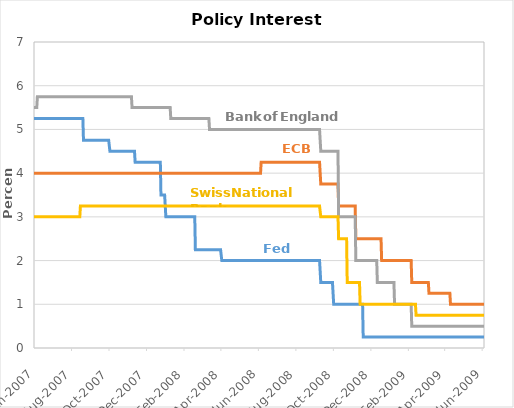
| Category | Federal Funds Target Rate | ECB Main Refinancing Operations Announcement Rate | BoE Official Bank Rate | SNB Libor Target Rate |
|---|---|---|---|---|
| 2007-01-02 | 5.25 | 3.5 | 5 | 2.5 |
| 2007-01-03 | 5.25 | 3.5 | 5 | 2.5 |
| 2007-01-04 | 5.25 | 3.5 | 5 | 2.5 |
| 2007-01-05 | 5.25 | 3.5 | 5 | 2.5 |
| 2007-01-08 | 5.25 | 3.5 | 5 | 2.5 |
| 2007-01-09 | 5.25 | 3.5 | 5 | 2.5 |
| 2007-01-10 | 5.25 | 3.5 | 5 | 2.5 |
| 2007-01-11 | 5.25 | 3.5 | 5.25 | 2.5 |
| 2007-01-12 | 5.25 | 3.5 | 5.25 | 2.5 |
| 2007-01-15 | 5.25 | 3.5 | 5.25 | 2.5 |
| 2007-01-16 | 5.25 | 3.5 | 5.25 | 2.5 |
| 2007-01-17 | 5.25 | 3.5 | 5.25 | 2.5 |
| 2007-01-18 | 5.25 | 3.5 | 5.25 | 2.5 |
| 2007-01-19 | 5.25 | 3.5 | 5.25 | 2.5 |
| 2007-01-22 | 5.25 | 3.5 | 5.25 | 2.5 |
| 2007-01-23 | 5.25 | 3.5 | 5.25 | 2.5 |
| 2007-01-24 | 5.25 | 3.5 | 5.25 | 2.5 |
| 2007-01-25 | 5.25 | 3.5 | 5.25 | 2.5 |
| 2007-01-26 | 5.25 | 3.5 | 5.25 | 2.5 |
| 2007-01-29 | 5.25 | 3.5 | 5.25 | 2.5 |
| 2007-01-30 | 5.25 | 3.5 | 5.25 | 2.5 |
| 2007-01-31 | 5.25 | 3.5 | 5.25 | 2.5 |
| 2007-02-01 | 5.25 | 3.5 | 5.25 | 2.5 |
| 2007-02-02 | 5.25 | 3.5 | 5.25 | 2.5 |
| 2007-02-05 | 5.25 | 3.5 | 5.25 | 2.5 |
| 2007-02-06 | 5.25 | 3.5 | 5.25 | 2.5 |
| 2007-02-07 | 5.25 | 3.5 | 5.25 | 2.5 |
| 2007-02-08 | 5.25 | 3.5 | 5.25 | 2.5 |
| 2007-02-09 | 5.25 | 3.5 | 5.25 | 2.5 |
| 2007-02-12 | 5.25 | 3.5 | 5.25 | 2.5 |
| 2007-02-13 | 5.25 | 3.5 | 5.25 | 2.5 |
| 2007-02-14 | 5.25 | 3.5 | 5.25 | 2.5 |
| 2007-02-15 | 5.25 | 3.5 | 5.25 | 2.5 |
| 2007-02-16 | 5.25 | 3.5 | 5.25 | 2.5 |
| 2007-02-19 | 5.25 | 3.5 | 5.25 | 2.5 |
| 2007-02-20 | 5.25 | 3.5 | 5.25 | 2.5 |
| 2007-02-21 | 5.25 | 3.5 | 5.25 | 2.5 |
| 2007-02-22 | 5.25 | 3.5 | 5.25 | 2.5 |
| 2007-02-23 | 5.25 | 3.5 | 5.25 | 2.5 |
| 2007-02-26 | 5.25 | 3.5 | 5.25 | 2.5 |
| 2007-02-27 | 5.25 | 3.5 | 5.25 | 2.5 |
| 2007-02-28 | 5.25 | 3.5 | 5.25 | 2.5 |
| 2007-03-01 | 5.25 | 3.5 | 5.25 | 2.5 |
| 2007-03-02 | 5.25 | 3.5 | 5.25 | 2.5 |
| 2007-03-05 | 5.25 | 3.5 | 5.25 | 2.5 |
| 2007-03-06 | 5.25 | 3.5 | 5.25 | 2.5 |
| 2007-03-07 | 5.25 | 3.5 | 5.25 | 2.5 |
| 2007-03-08 | 5.25 | 3.75 | 5.25 | 2.5 |
| 2007-03-09 | 5.25 | 3.75 | 5.25 | 2.5 |
| 2007-03-12 | 5.25 | 3.75 | 5.25 | 2.5 |
| 2007-03-13 | 5.25 | 3.75 | 5.25 | 2.5 |
| 2007-03-14 | 5.25 | 3.75 | 5.25 | 2.5 |
| 2007-03-15 | 5.25 | 3.75 | 5.25 | 2.75 |
| 2007-03-16 | 5.25 | 3.75 | 5.25 | 2.75 |
| 2007-03-19 | 5.25 | 3.75 | 5.25 | 2.75 |
| 2007-03-20 | 5.25 | 3.75 | 5.25 | 2.75 |
| 2007-03-21 | 5.25 | 3.75 | 5.25 | 2.75 |
| 2007-03-22 | 5.25 | 3.75 | 5.25 | 2.75 |
| 2007-03-23 | 5.25 | 3.75 | 5.25 | 2.75 |
| 2007-03-26 | 5.25 | 3.75 | 5.25 | 2.75 |
| 2007-03-27 | 5.25 | 3.75 | 5.25 | 2.75 |
| 2007-03-28 | 5.25 | 3.75 | 5.25 | 2.75 |
| 2007-03-29 | 5.25 | 3.75 | 5.25 | 2.75 |
| 2007-03-30 | 5.25 | 3.75 | 5.25 | 2.75 |
| 2007-04-02 | 5.25 | 3.75 | 5.25 | 2.75 |
| 2007-04-03 | 5.25 | 3.75 | 5.25 | 2.75 |
| 2007-04-04 | 5.25 | 3.75 | 5.25 | 2.75 |
| 2007-04-05 | 5.25 | 3.75 | 5.25 | 2.75 |
| 2007-04-06 | 5.25 | 3.75 | 5.25 | 2.75 |
| 2007-04-09 | 5.25 | 3.75 | 5.25 | 2.75 |
| 2007-04-10 | 5.25 | 3.75 | 5.25 | 2.75 |
| 2007-04-11 | 5.25 | 3.75 | 5.25 | 2.75 |
| 2007-04-12 | 5.25 | 3.75 | 5.25 | 2.75 |
| 2007-04-13 | 5.25 | 3.75 | 5.25 | 2.75 |
| 2007-04-16 | 5.25 | 3.75 | 5.25 | 2.75 |
| 2007-04-17 | 5.25 | 3.75 | 5.25 | 2.75 |
| 2007-04-18 | 5.25 | 3.75 | 5.25 | 2.75 |
| 2007-04-19 | 5.25 | 3.75 | 5.25 | 2.75 |
| 2007-04-20 | 5.25 | 3.75 | 5.25 | 2.75 |
| 2007-04-23 | 5.25 | 3.75 | 5.25 | 2.75 |
| 2007-04-24 | 5.25 | 3.75 | 5.25 | 2.75 |
| 2007-04-25 | 5.25 | 3.75 | 5.25 | 2.75 |
| 2007-04-26 | 5.25 | 3.75 | 5.25 | 2.75 |
| 2007-04-27 | 5.25 | 3.75 | 5.25 | 2.75 |
| 2007-04-30 | 5.25 | 3.75 | 5.25 | 2.75 |
| 2007-05-01 | 5.25 | 3.75 | 5.25 | 2.75 |
| 2007-05-02 | 5.25 | 3.75 | 5.25 | 2.75 |
| 2007-05-03 | 5.25 | 3.75 | 5.25 | 2.75 |
| 2007-05-04 | 5.25 | 3.75 | 5.25 | 2.75 |
| 2007-05-07 | 5.25 | 3.75 | 5.25 | 2.75 |
| 2007-05-08 | 5.25 | 3.75 | 5.25 | 2.75 |
| 2007-05-09 | 5.25 | 3.75 | 5.25 | 2.75 |
| 2007-05-10 | 5.25 | 3.75 | 5.5 | 2.75 |
| 2007-05-11 | 5.25 | 3.75 | 5.5 | 2.75 |
| 2007-05-14 | 5.25 | 3.75 | 5.5 | 2.75 |
| 2007-05-15 | 5.25 | 3.75 | 5.5 | 2.75 |
| 2007-05-16 | 5.25 | 3.75 | 5.5 | 2.75 |
| 2007-05-17 | 5.25 | 3.75 | 5.5 | 2.75 |
| 2007-05-18 | 5.25 | 3.75 | 5.5 | 2.75 |
| 2007-05-21 | 5.25 | 3.75 | 5.5 | 2.75 |
| 2007-05-22 | 5.25 | 3.75 | 5.5 | 2.75 |
| 2007-05-23 | 5.25 | 3.75 | 5.5 | 2.75 |
| 2007-05-24 | 5.25 | 3.75 | 5.5 | 2.75 |
| 2007-05-25 | 5.25 | 3.75 | 5.5 | 2.75 |
| 2007-05-28 | 5.25 | 3.75 | 5.5 | 2.75 |
| 2007-05-29 | 5.25 | 3.75 | 5.5 | 2.75 |
| 2007-05-30 | 5.25 | 3.75 | 5.5 | 2.75 |
| 2007-05-31 | 5.25 | 3.75 | 5.5 | 2.75 |
| 2007-06-01 | 5.25 | 3.75 | 5.5 | 2.75 |
| 2007-06-04 | 5.25 | 3.75 | 5.5 | 2.75 |
| 2007-06-05 | 5.25 | 3.75 | 5.5 | 2.75 |
| 2007-06-06 | 5.25 | 4 | 5.5 | 2.75 |
| 2007-06-07 | 5.25 | 4 | 5.5 | 2.75 |
| 2007-06-08 | 5.25 | 4 | 5.5 | 2.75 |
| 2007-06-11 | 5.25 | 4 | 5.5 | 2.75 |
| 2007-06-12 | 5.25 | 4 | 5.5 | 2.75 |
| 2007-06-13 | 5.25 | 4 | 5.5 | 2.75 |
| 2007-06-14 | 5.25 | 4 | 5.5 | 3 |
| 2007-06-15 | 5.25 | 4 | 5.5 | 3 |
| 2007-06-18 | 5.25 | 4 | 5.5 | 3 |
| 2007-06-19 | 5.25 | 4 | 5.5 | 3 |
| 2007-06-20 | 5.25 | 4 | 5.5 | 3 |
| 2007-06-21 | 5.25 | 4 | 5.5 | 3 |
| 2007-06-22 | 5.25 | 4 | 5.5 | 3 |
| 2007-06-25 | 5.25 | 4 | 5.5 | 3 |
| 2007-06-26 | 5.25 | 4 | 5.5 | 3 |
| 2007-06-27 | 5.25 | 4 | 5.5 | 3 |
| 2007-06-28 | 5.25 | 4 | 5.5 | 3 |
| 2007-06-29 | 5.25 | 4 | 5.5 | 3 |
| 2007-07-02 | 5.25 | 4 | 5.5 | 3 |
| 2007-07-03 | 5.25 | 4 | 5.5 | 3 |
| 2007-07-04 | 5.25 | 4 | 5.5 | 3 |
| 2007-07-05 | 5.25 | 4 | 5.75 | 3 |
| 2007-07-06 | 5.25 | 4 | 5.75 | 3 |
| 2007-07-09 | 5.25 | 4 | 5.75 | 3 |
| 2007-07-10 | 5.25 | 4 | 5.75 | 3 |
| 2007-07-11 | 5.25 | 4 | 5.75 | 3 |
| 2007-07-12 | 5.25 | 4 | 5.75 | 3 |
| 2007-07-13 | 5.25 | 4 | 5.75 | 3 |
| 2007-07-16 | 5.25 | 4 | 5.75 | 3 |
| 2007-07-17 | 5.25 | 4 | 5.75 | 3 |
| 2007-07-18 | 5.25 | 4 | 5.75 | 3 |
| 2007-07-19 | 5.25 | 4 | 5.75 | 3 |
| 2007-07-20 | 5.25 | 4 | 5.75 | 3 |
| 2007-07-23 | 5.25 | 4 | 5.75 | 3 |
| 2007-07-24 | 5.25 | 4 | 5.75 | 3 |
| 2007-07-25 | 5.25 | 4 | 5.75 | 3 |
| 2007-07-26 | 5.25 | 4 | 5.75 | 3 |
| 2007-07-27 | 5.25 | 4 | 5.75 | 3 |
| 2007-07-30 | 5.25 | 4 | 5.75 | 3 |
| 2007-07-31 | 5.25 | 4 | 5.75 | 3 |
| 2007-08-01 | 5.25 | 4 | 5.75 | 3 |
| 2007-08-02 | 5.25 | 4 | 5.75 | 3 |
| 2007-08-03 | 5.25 | 4 | 5.75 | 3 |
| 2007-08-06 | 5.25 | 4 | 5.75 | 3 |
| 2007-08-07 | 5.25 | 4 | 5.75 | 3 |
| 2007-08-08 | 5.25 | 4 | 5.75 | 3 |
| 2007-08-09 | 5.25 | 4 | 5.75 | 3 |
| 2007-08-10 | 5.25 | 4 | 5.75 | 3 |
| 2007-08-13 | 5.25 | 4 | 5.75 | 3 |
| 2007-08-14 | 5.25 | 4 | 5.75 | 3 |
| 2007-08-15 | 5.25 | 4 | 5.75 | 3 |
| 2007-08-16 | 5.25 | 4 | 5.75 | 3 |
| 2007-08-17 | 5.25 | 4 | 5.75 | 3 |
| 2007-08-20 | 5.25 | 4 | 5.75 | 3 |
| 2007-08-21 | 5.25 | 4 | 5.75 | 3 |
| 2007-08-22 | 5.25 | 4 | 5.75 | 3 |
| 2007-08-23 | 5.25 | 4 | 5.75 | 3 |
| 2007-08-24 | 5.25 | 4 | 5.75 | 3 |
| 2007-08-27 | 5.25 | 4 | 5.75 | 3 |
| 2007-08-28 | 5.25 | 4 | 5.75 | 3 |
| 2007-08-29 | 5.25 | 4 | 5.75 | 3 |
| 2007-08-30 | 5.25 | 4 | 5.75 | 3 |
| 2007-08-31 | 5.25 | 4 | 5.75 | 3 |
| 2007-09-03 | 5.25 | 4 | 5.75 | 3 |
| 2007-09-04 | 5.25 | 4 | 5.75 | 3 |
| 2007-09-05 | 5.25 | 4 | 5.75 | 3 |
| 2007-09-06 | 5.25 | 4 | 5.75 | 3 |
| 2007-09-07 | 5.25 | 4 | 5.75 | 3 |
| 2007-09-10 | 5.25 | 4 | 5.75 | 3 |
| 2007-09-11 | 5.25 | 4 | 5.75 | 3 |
| 2007-09-12 | 5.25 | 4 | 5.75 | 3 |
| 2007-09-13 | 5.25 | 4 | 5.75 | 3.25 |
| 2007-09-14 | 5.25 | 4 | 5.75 | 3.25 |
| 2007-09-17 | 5.25 | 4 | 5.75 | 3.25 |
| 2007-09-18 | 4.75 | 4 | 5.75 | 3.25 |
| 2007-09-19 | 4.75 | 4 | 5.75 | 3.25 |
| 2007-09-20 | 4.75 | 4 | 5.75 | 3.25 |
| 2007-09-21 | 4.75 | 4 | 5.75 | 3.25 |
| 2007-09-24 | 4.75 | 4 | 5.75 | 3.25 |
| 2007-09-25 | 4.75 | 4 | 5.75 | 3.25 |
| 2007-09-26 | 4.75 | 4 | 5.75 | 3.25 |
| 2007-09-27 | 4.75 | 4 | 5.75 | 3.25 |
| 2007-09-28 | 4.75 | 4 | 5.75 | 3.25 |
| 2007-10-01 | 4.75 | 4 | 5.75 | 3.25 |
| 2007-10-02 | 4.75 | 4 | 5.75 | 3.25 |
| 2007-10-03 | 4.75 | 4 | 5.75 | 3.25 |
| 2007-10-04 | 4.75 | 4 | 5.75 | 3.25 |
| 2007-10-05 | 4.75 | 4 | 5.75 | 3.25 |
| 2007-10-08 | 4.75 | 4 | 5.75 | 3.25 |
| 2007-10-09 | 4.75 | 4 | 5.75 | 3.25 |
| 2007-10-10 | 4.75 | 4 | 5.75 | 3.25 |
| 2007-10-11 | 4.75 | 4 | 5.75 | 3.25 |
| 2007-10-12 | 4.75 | 4 | 5.75 | 3.25 |
| 2007-10-15 | 4.75 | 4 | 5.75 | 3.25 |
| 2007-10-16 | 4.75 | 4 | 5.75 | 3.25 |
| 2007-10-17 | 4.75 | 4 | 5.75 | 3.25 |
| 2007-10-18 | 4.75 | 4 | 5.75 | 3.25 |
| 2007-10-19 | 4.75 | 4 | 5.75 | 3.25 |
| 2007-10-22 | 4.75 | 4 | 5.75 | 3.25 |
| 2007-10-23 | 4.75 | 4 | 5.75 | 3.25 |
| 2007-10-24 | 4.75 | 4 | 5.75 | 3.25 |
| 2007-10-25 | 4.75 | 4 | 5.75 | 3.25 |
| 2007-10-26 | 4.75 | 4 | 5.75 | 3.25 |
| 2007-10-29 | 4.75 | 4 | 5.75 | 3.25 |
| 2007-10-30 | 4.75 | 4 | 5.75 | 3.25 |
| 2007-10-31 | 4.5 | 4 | 5.75 | 3.25 |
| 2007-11-01 | 4.5 | 4 | 5.75 | 3.25 |
| 2007-11-02 | 4.5 | 4 | 5.75 | 3.25 |
| 2007-11-05 | 4.5 | 4 | 5.75 | 3.25 |
| 2007-11-06 | 4.5 | 4 | 5.75 | 3.25 |
| 2007-11-07 | 4.5 | 4 | 5.75 | 3.25 |
| 2007-11-08 | 4.5 | 4 | 5.75 | 3.25 |
| 2007-11-09 | 4.5 | 4 | 5.75 | 3.25 |
| 2007-11-12 | 4.5 | 4 | 5.75 | 3.25 |
| 2007-11-13 | 4.5 | 4 | 5.75 | 3.25 |
| 2007-11-14 | 4.5 | 4 | 5.75 | 3.25 |
| 2007-11-15 | 4.5 | 4 | 5.75 | 3.25 |
| 2007-11-16 | 4.5 | 4 | 5.75 | 3.25 |
| 2007-11-19 | 4.5 | 4 | 5.75 | 3.25 |
| 2007-11-20 | 4.5 | 4 | 5.75 | 3.25 |
| 2007-11-21 | 4.5 | 4 | 5.75 | 3.25 |
| 2007-11-22 | 4.5 | 4 | 5.75 | 3.25 |
| 2007-11-23 | 4.5 | 4 | 5.75 | 3.25 |
| 2007-11-26 | 4.5 | 4 | 5.75 | 3.25 |
| 2007-11-27 | 4.5 | 4 | 5.75 | 3.25 |
| 2007-11-28 | 4.5 | 4 | 5.75 | 3.25 |
| 2007-11-29 | 4.5 | 4 | 5.75 | 3.25 |
| 2007-11-30 | 4.5 | 4 | 5.75 | 3.25 |
| 2007-12-03 | 4.5 | 4 | 5.75 | 3.25 |
| 2007-12-04 | 4.5 | 4 | 5.75 | 3.25 |
| 2007-12-05 | 4.5 | 4 | 5.75 | 3.25 |
| 2007-12-06 | 4.5 | 4 | 5.5 | 3.25 |
| 2007-12-07 | 4.5 | 4 | 5.5 | 3.25 |
| 2007-12-10 | 4.5 | 4 | 5.5 | 3.25 |
| 2007-12-11 | 4.25 | 4 | 5.5 | 3.25 |
| 2007-12-12 | 4.25 | 4 | 5.5 | 3.25 |
| 2007-12-13 | 4.25 | 4 | 5.5 | 3.25 |
| 2007-12-14 | 4.25 | 4 | 5.5 | 3.25 |
| 2007-12-17 | 4.25 | 4 | 5.5 | 3.25 |
| 2007-12-18 | 4.25 | 4 | 5.5 | 3.25 |
| 2007-12-19 | 4.25 | 4 | 5.5 | 3.25 |
| 2007-12-20 | 4.25 | 4 | 5.5 | 3.25 |
| 2007-12-21 | 4.25 | 4 | 5.5 | 3.25 |
| 2007-12-24 | 4.25 | 4 | 5.5 | 3.25 |
| 2007-12-25 | 4.25 | 4 | 5.5 | 3.25 |
| 2007-12-26 | 4.25 | 4 | 5.5 | 3.25 |
| 2007-12-27 | 4.25 | 4 | 5.5 | 3.25 |
| 2007-12-28 | 4.25 | 4 | 5.5 | 3.25 |
| 2007-12-31 | 4.25 | 4 | 5.5 | 3.25 |
| 2008-01-01 | 4.25 | 4 | 5.5 | 3.25 |
| 2008-01-02 | 4.25 | 4 | 5.5 | 3.25 |
| 2008-01-03 | 4.25 | 4 | 5.5 | 3.25 |
| 2008-01-04 | 4.25 | 4 | 5.5 | 3.25 |
| 2008-01-07 | 4.25 | 4 | 5.5 | 3.25 |
| 2008-01-08 | 4.25 | 4 | 5.5 | 3.25 |
| 2008-01-09 | 4.25 | 4 | 5.5 | 3.25 |
| 2008-01-10 | 4.25 | 4 | 5.5 | 3.25 |
| 2008-01-11 | 4.25 | 4 | 5.5 | 3.25 |
| 2008-01-14 | 4.25 | 4 | 5.5 | 3.25 |
| 2008-01-15 | 4.25 | 4 | 5.5 | 3.25 |
| 2008-01-16 | 4.25 | 4 | 5.5 | 3.25 |
| 2008-01-17 | 4.25 | 4 | 5.5 | 3.25 |
| 2008-01-18 | 4.25 | 4 | 5.5 | 3.25 |
| 2008-01-21 | 4.25 | 4 | 5.5 | 3.25 |
| 2008-01-22 | 3.5 | 4 | 5.5 | 3.25 |
| 2008-01-23 | 3.5 | 4 | 5.5 | 3.25 |
| 2008-01-24 | 3.5 | 4 | 5.5 | 3.25 |
| 2008-01-25 | 3.5 | 4 | 5.5 | 3.25 |
| 2008-01-28 | 3.5 | 4 | 5.5 | 3.25 |
| 2008-01-29 | 3.5 | 4 | 5.5 | 3.25 |
| 2008-01-30 | 3 | 4 | 5.5 | 3.25 |
| 2008-01-31 | 3 | 4 | 5.5 | 3.25 |
| 2008-02-01 | 3 | 4 | 5.5 | 3.25 |
| 2008-02-04 | 3 | 4 | 5.5 | 3.25 |
| 2008-02-05 | 3 | 4 | 5.5 | 3.25 |
| 2008-02-06 | 3 | 4 | 5.5 | 3.25 |
| 2008-02-07 | 3 | 4 | 5.25 | 3.25 |
| 2008-02-08 | 3 | 4 | 5.25 | 3.25 |
| 2008-02-11 | 3 | 4 | 5.25 | 3.25 |
| 2008-02-12 | 3 | 4 | 5.25 | 3.25 |
| 2008-02-13 | 3 | 4 | 5.25 | 3.25 |
| 2008-02-14 | 3 | 4 | 5.25 | 3.25 |
| 2008-02-15 | 3 | 4 | 5.25 | 3.25 |
| 2008-02-18 | 3 | 4 | 5.25 | 3.25 |
| 2008-02-19 | 3 | 4 | 5.25 | 3.25 |
| 2008-02-20 | 3 | 4 | 5.25 | 3.25 |
| 2008-02-21 | 3 | 4 | 5.25 | 3.25 |
| 2008-02-22 | 3 | 4 | 5.25 | 3.25 |
| 2008-02-25 | 3 | 4 | 5.25 | 3.25 |
| 2008-02-26 | 3 | 4 | 5.25 | 3.25 |
| 2008-02-27 | 3 | 4 | 5.25 | 3.25 |
| 2008-02-28 | 3 | 4 | 5.25 | 3.25 |
| 2008-02-29 | 3 | 4 | 5.25 | 3.25 |
| 2008-03-03 | 3 | 4 | 5.25 | 3.25 |
| 2008-03-04 | 3 | 4 | 5.25 | 3.25 |
| 2008-03-05 | 3 | 4 | 5.25 | 3.25 |
| 2008-03-06 | 3 | 4 | 5.25 | 3.25 |
| 2008-03-07 | 3 | 4 | 5.25 | 3.25 |
| 2008-03-10 | 3 | 4 | 5.25 | 3.25 |
| 2008-03-11 | 3 | 4 | 5.25 | 3.25 |
| 2008-03-12 | 3 | 4 | 5.25 | 3.25 |
| 2008-03-13 | 3 | 4 | 5.25 | 3.25 |
| 2008-03-14 | 3 | 4 | 5.25 | 3.25 |
| 2008-03-17 | 3 | 4 | 5.25 | 3.25 |
| 2008-03-18 | 2.25 | 4 | 5.25 | 3.25 |
| 2008-03-19 | 2.25 | 4 | 5.25 | 3.25 |
| 2008-03-20 | 2.25 | 4 | 5.25 | 3.25 |
| 2008-03-21 | 2.25 | 4 | 5.25 | 3.25 |
| 2008-03-24 | 2.25 | 4 | 5.25 | 3.25 |
| 2008-03-25 | 2.25 | 4 | 5.25 | 3.25 |
| 2008-03-26 | 2.25 | 4 | 5.25 | 3.25 |
| 2008-03-27 | 2.25 | 4 | 5.25 | 3.25 |
| 2008-03-28 | 2.25 | 4 | 5.25 | 3.25 |
| 2008-03-31 | 2.25 | 4 | 5.25 | 3.25 |
| 2008-04-01 | 2.25 | 4 | 5.25 | 3.25 |
| 2008-04-02 | 2.25 | 4 | 5.25 | 3.25 |
| 2008-04-03 | 2.25 | 4 | 5.25 | 3.25 |
| 2008-04-04 | 2.25 | 4 | 5.25 | 3.25 |
| 2008-04-07 | 2.25 | 4 | 5.25 | 3.25 |
| 2008-04-08 | 2.25 | 4 | 5.25 | 3.25 |
| 2008-04-09 | 2.25 | 4 | 5.25 | 3.25 |
| 2008-04-10 | 2.25 | 4 | 5 | 3.25 |
| 2008-04-11 | 2.25 | 4 | 5 | 3.25 |
| 2008-04-14 | 2.25 | 4 | 5 | 3.25 |
| 2008-04-15 | 2.25 | 4 | 5 | 3.25 |
| 2008-04-16 | 2.25 | 4 | 5 | 3.25 |
| 2008-04-17 | 2.25 | 4 | 5 | 3.25 |
| 2008-04-18 | 2.25 | 4 | 5 | 3.25 |
| 2008-04-21 | 2.25 | 4 | 5 | 3.25 |
| 2008-04-22 | 2.25 | 4 | 5 | 3.25 |
| 2008-04-23 | 2.25 | 4 | 5 | 3.25 |
| 2008-04-24 | 2.25 | 4 | 5 | 3.25 |
| 2008-04-25 | 2.25 | 4 | 5 | 3.25 |
| 2008-04-28 | 2.25 | 4 | 5 | 3.25 |
| 2008-04-29 | 2.25 | 4 | 5 | 3.25 |
| 2008-04-30 | 2 | 4 | 5 | 3.25 |
| 2008-05-01 | 2 | 4 | 5 | 3.25 |
| 2008-05-02 | 2 | 4 | 5 | 3.25 |
| 2008-05-05 | 2 | 4 | 5 | 3.25 |
| 2008-05-06 | 2 | 4 | 5 | 3.25 |
| 2008-05-07 | 2 | 4 | 5 | 3.25 |
| 2008-05-08 | 2 | 4 | 5 | 3.25 |
| 2008-05-09 | 2 | 4 | 5 | 3.25 |
| 2008-05-12 | 2 | 4 | 5 | 3.25 |
| 2008-05-13 | 2 | 4 | 5 | 3.25 |
| 2008-05-14 | 2 | 4 | 5 | 3.25 |
| 2008-05-15 | 2 | 4 | 5 | 3.25 |
| 2008-05-16 | 2 | 4 | 5 | 3.25 |
| 2008-05-19 | 2 | 4 | 5 | 3.25 |
| 2008-05-20 | 2 | 4 | 5 | 3.25 |
| 2008-05-21 | 2 | 4 | 5 | 3.25 |
| 2008-05-22 | 2 | 4 | 5 | 3.25 |
| 2008-05-23 | 2 | 4 | 5 | 3.25 |
| 2008-05-26 | 2 | 4 | 5 | 3.25 |
| 2008-05-27 | 2 | 4 | 5 | 3.25 |
| 2008-05-28 | 2 | 4 | 5 | 3.25 |
| 2008-05-29 | 2 | 4 | 5 | 3.25 |
| 2008-05-30 | 2 | 4 | 5 | 3.25 |
| 2008-06-02 | 2 | 4 | 5 | 3.25 |
| 2008-06-03 | 2 | 4 | 5 | 3.25 |
| 2008-06-04 | 2 | 4 | 5 | 3.25 |
| 2008-06-05 | 2 | 4 | 5 | 3.25 |
| 2008-06-06 | 2 | 4 | 5 | 3.25 |
| 2008-06-09 | 2 | 4 | 5 | 3.25 |
| 2008-06-10 | 2 | 4 | 5 | 3.25 |
| 2008-06-11 | 2 | 4 | 5 | 3.25 |
| 2008-06-12 | 2 | 4 | 5 | 3.25 |
| 2008-06-13 | 2 | 4 | 5 | 3.25 |
| 2008-06-16 | 2 | 4 | 5 | 3.25 |
| 2008-06-17 | 2 | 4 | 5 | 3.25 |
| 2008-06-18 | 2 | 4 | 5 | 3.25 |
| 2008-06-19 | 2 | 4 | 5 | 3.25 |
| 2008-06-20 | 2 | 4 | 5 | 3.25 |
| 2008-06-23 | 2 | 4 | 5 | 3.25 |
| 2008-06-24 | 2 | 4 | 5 | 3.25 |
| 2008-06-25 | 2 | 4 | 5 | 3.25 |
| 2008-06-26 | 2 | 4 | 5 | 3.25 |
| 2008-06-27 | 2 | 4 | 5 | 3.25 |
| 2008-06-30 | 2 | 4 | 5 | 3.25 |
| 2008-07-01 | 2 | 4 | 5 | 3.25 |
| 2008-07-02 | 2 | 4 | 5 | 3.25 |
| 2008-07-03 | 2 | 4.25 | 5 | 3.25 |
| 2008-07-04 | 2 | 4.25 | 5 | 3.25 |
| 2008-07-07 | 2 | 4.25 | 5 | 3.25 |
| 2008-07-08 | 2 | 4.25 | 5 | 3.25 |
| 2008-07-09 | 2 | 4.25 | 5 | 3.25 |
| 2008-07-10 | 2 | 4.25 | 5 | 3.25 |
| 2008-07-11 | 2 | 4.25 | 5 | 3.25 |
| 2008-07-14 | 2 | 4.25 | 5 | 3.25 |
| 2008-07-15 | 2 | 4.25 | 5 | 3.25 |
| 2008-07-16 | 2 | 4.25 | 5 | 3.25 |
| 2008-07-17 | 2 | 4.25 | 5 | 3.25 |
| 2008-07-18 | 2 | 4.25 | 5 | 3.25 |
| 2008-07-21 | 2 | 4.25 | 5 | 3.25 |
| 2008-07-22 | 2 | 4.25 | 5 | 3.25 |
| 2008-07-23 | 2 | 4.25 | 5 | 3.25 |
| 2008-07-24 | 2 | 4.25 | 5 | 3.25 |
| 2008-07-25 | 2 | 4.25 | 5 | 3.25 |
| 2008-07-28 | 2 | 4.25 | 5 | 3.25 |
| 2008-07-29 | 2 | 4.25 | 5 | 3.25 |
| 2008-07-30 | 2 | 4.25 | 5 | 3.25 |
| 2008-07-31 | 2 | 4.25 | 5 | 3.25 |
| 2008-08-01 | 2 | 4.25 | 5 | 3.25 |
| 2008-08-04 | 2 | 4.25 | 5 | 3.25 |
| 2008-08-05 | 2 | 4.25 | 5 | 3.25 |
| 2008-08-06 | 2 | 4.25 | 5 | 3.25 |
| 2008-08-07 | 2 | 4.25 | 5 | 3.25 |
| 2008-08-08 | 2 | 4.25 | 5 | 3.25 |
| 2008-08-11 | 2 | 4.25 | 5 | 3.25 |
| 2008-08-12 | 2 | 4.25 | 5 | 3.25 |
| 2008-08-13 | 2 | 4.25 | 5 | 3.25 |
| 2008-08-14 | 2 | 4.25 | 5 | 3.25 |
| 2008-08-15 | 2 | 4.25 | 5 | 3.25 |
| 2008-08-18 | 2 | 4.25 | 5 | 3.25 |
| 2008-08-19 | 2 | 4.25 | 5 | 3.25 |
| 2008-08-20 | 2 | 4.25 | 5 | 3.25 |
| 2008-08-21 | 2 | 4.25 | 5 | 3.25 |
| 2008-08-22 | 2 | 4.25 | 5 | 3.25 |
| 2008-08-25 | 2 | 4.25 | 5 | 3.25 |
| 2008-08-26 | 2 | 4.25 | 5 | 3.25 |
| 2008-08-27 | 2 | 4.25 | 5 | 3.25 |
| 2008-08-28 | 2 | 4.25 | 5 | 3.25 |
| 2008-08-29 | 2 | 4.25 | 5 | 3.25 |
| 2008-09-01 | 2 | 4.25 | 5 | 3.25 |
| 2008-09-02 | 2 | 4.25 | 5 | 3.25 |
| 2008-09-03 | 2 | 4.25 | 5 | 3.25 |
| 2008-09-04 | 2 | 4.25 | 5 | 3.25 |
| 2008-09-05 | 2 | 4.25 | 5 | 3.25 |
| 2008-09-08 | 2 | 4.25 | 5 | 3.25 |
| 2008-09-09 | 2 | 4.25 | 5 | 3.25 |
| 2008-09-10 | 2 | 4.25 | 5 | 3.25 |
| 2008-09-11 | 2 | 4.25 | 5 | 3.25 |
| 2008-09-12 | 2 | 4.25 | 5 | 3.25 |
| 2008-09-15 | 2 | 4.25 | 5 | 3.25 |
| 2008-09-16 | 2 | 4.25 | 5 | 3.25 |
| 2008-09-17 | 2 | 4.25 | 5 | 3.25 |
| 2008-09-18 | 2 | 4.25 | 5 | 3.25 |
| 2008-09-19 | 2 | 4.25 | 5 | 3.25 |
| 2008-09-22 | 2 | 4.25 | 5 | 3.25 |
| 2008-09-23 | 2 | 4.25 | 5 | 3.25 |
| 2008-09-24 | 2 | 4.25 | 5 | 3.25 |
| 2008-09-25 | 2 | 4.25 | 5 | 3.25 |
| 2008-09-26 | 2 | 4.25 | 5 | 3.25 |
| 2008-09-29 | 2 | 4.25 | 5 | 3.25 |
| 2008-09-30 | 2 | 4.25 | 5 | 3.25 |
| 2008-10-01 | 2 | 4.25 | 5 | 3.25 |
| 2008-10-02 | 2 | 4.25 | 5 | 3.25 |
| 2008-10-03 | 2 | 4.25 | 5 | 3.25 |
| 2008-10-06 | 2 | 4.25 | 5 | 3.25 |
| 2008-10-07 | 2 | 4.25 | 5 | 3.25 |
| 2008-10-08 | 1.5 | 3.75 | 4.5 | 3 |
| 2008-10-09 | 1.5 | 3.75 | 4.5 | 3 |
| 2008-10-10 | 1.5 | 3.75 | 4.5 | 3 |
| 2008-10-13 | 1.5 | 3.75 | 4.5 | 3 |
| 2008-10-14 | 1.5 | 3.75 | 4.5 | 3 |
| 2008-10-15 | 1.5 | 3.75 | 4.5 | 3 |
| 2008-10-16 | 1.5 | 3.75 | 4.5 | 3 |
| 2008-10-17 | 1.5 | 3.75 | 4.5 | 3 |
| 2008-10-20 | 1.5 | 3.75 | 4.5 | 3 |
| 2008-10-21 | 1.5 | 3.75 | 4.5 | 3 |
| 2008-10-22 | 1.5 | 3.75 | 4.5 | 3 |
| 2008-10-23 | 1.5 | 3.75 | 4.5 | 3 |
| 2008-10-24 | 1.5 | 3.75 | 4.5 | 3 |
| 2008-10-27 | 1.5 | 3.75 | 4.5 | 3 |
| 2008-10-28 | 1.5 | 3.75 | 4.5 | 3 |
| 2008-10-29 | 1 | 3.75 | 4.5 | 3 |
| 2008-10-30 | 1 | 3.75 | 4.5 | 3 |
| 2008-10-31 | 1 | 3.75 | 4.5 | 3 |
| 2008-11-03 | 1 | 3.75 | 4.5 | 3 |
| 2008-11-04 | 1 | 3.75 | 4.5 | 3 |
| 2008-11-05 | 1 | 3.75 | 4.5 | 3 |
| 2008-11-06 | 1 | 3.25 | 3 | 2.5 |
| 2008-11-07 | 1 | 3.25 | 3 | 2.5 |
| 2008-11-10 | 1 | 3.25 | 3 | 2.5 |
| 2008-11-11 | 1 | 3.25 | 3 | 2.5 |
| 2008-11-12 | 1 | 3.25 | 3 | 2.5 |
| 2008-11-13 | 1 | 3.25 | 3 | 2.5 |
| 2008-11-14 | 1 | 3.25 | 3 | 2.5 |
| 2008-11-17 | 1 | 3.25 | 3 | 2.5 |
| 2008-11-18 | 1 | 3.25 | 3 | 2.5 |
| 2008-11-19 | 1 | 3.25 | 3 | 2.5 |
| 2008-11-20 | 1 | 3.25 | 3 | 1.5 |
| 2008-11-21 | 1 | 3.25 | 3 | 1.5 |
| 2008-11-24 | 1 | 3.25 | 3 | 1.5 |
| 2008-11-25 | 1 | 3.25 | 3 | 1.5 |
| 2008-11-26 | 1 | 3.25 | 3 | 1.5 |
| 2008-11-27 | 1 | 3.25 | 3 | 1.5 |
| 2008-11-28 | 1 | 3.25 | 3 | 1.5 |
| 2008-12-01 | 1 | 3.25 | 3 | 1.5 |
| 2008-12-02 | 1 | 3.25 | 3 | 1.5 |
| 2008-12-03 | 1 | 3.25 | 3 | 1.5 |
| 2008-12-04 | 1 | 2.5 | 2 | 1.5 |
| 2008-12-05 | 1 | 2.5 | 2 | 1.5 |
| 2008-12-08 | 1 | 2.5 | 2 | 1.5 |
| 2008-12-09 | 1 | 2.5 | 2 | 1.5 |
| 2008-12-10 | 1 | 2.5 | 2 | 1.5 |
| 2008-12-11 | 1 | 2.5 | 2 | 1 |
| 2008-12-12 | 1 | 2.5 | 2 | 1 |
| 2008-12-15 | 1 | 2.5 | 2 | 1 |
| 2008-12-16 | 0.25 | 2.5 | 2 | 1 |
| 2008-12-17 | 0.25 | 2.5 | 2 | 1 |
| 2008-12-18 | 0.25 | 2.5 | 2 | 1 |
| 2008-12-19 | 0.25 | 2.5 | 2 | 1 |
| 2008-12-22 | 0.25 | 2.5 | 2 | 1 |
| 2008-12-23 | 0.25 | 2.5 | 2 | 1 |
| 2008-12-24 | 0.25 | 2.5 | 2 | 1 |
| 2008-12-25 | 0.25 | 2.5 | 2 | 1 |
| 2008-12-26 | 0.25 | 2.5 | 2 | 1 |
| 2008-12-29 | 0.25 | 2.5 | 2 | 1 |
| 2008-12-30 | 0.25 | 2.5 | 2 | 1 |
| 2008-12-31 | 0.25 | 2.5 | 2 | 1 |
| 2009-01-01 | 0.25 | 2.5 | 2 | 1 |
| 2009-01-02 | 0.25 | 2.5 | 2 | 1 |
| 2009-01-05 | 0.25 | 2.5 | 2 | 1 |
| 2009-01-06 | 0.25 | 2.5 | 2 | 1 |
| 2009-01-07 | 0.25 | 2.5 | 2 | 1 |
| 2009-01-08 | 0.25 | 2.5 | 1.5 | 1 |
| 2009-01-09 | 0.25 | 2.5 | 1.5 | 1 |
| 2009-01-12 | 0.25 | 2.5 | 1.5 | 1 |
| 2009-01-13 | 0.25 | 2.5 | 1.5 | 1 |
| 2009-01-14 | 0.25 | 2.5 | 1.5 | 1 |
| 2009-01-15 | 0.25 | 2 | 1.5 | 1 |
| 2009-01-16 | 0.25 | 2 | 1.5 | 1 |
| 2009-01-19 | 0.25 | 2 | 1.5 | 1 |
| 2009-01-20 | 0.25 | 2 | 1.5 | 1 |
| 2009-01-21 | 0.25 | 2 | 1.5 | 1 |
| 2009-01-22 | 0.25 | 2 | 1.5 | 1 |
| 2009-01-23 | 0.25 | 2 | 1.5 | 1 |
| 2009-01-26 | 0.25 | 2 | 1.5 | 1 |
| 2009-01-27 | 0.25 | 2 | 1.5 | 1 |
| 2009-01-28 | 0.25 | 2 | 1.5 | 1 |
| 2009-01-29 | 0.25 | 2 | 1.5 | 1 |
| 2009-01-30 | 0.25 | 2 | 1.5 | 1 |
| 2009-02-02 | 0.25 | 2 | 1.5 | 1 |
| 2009-02-03 | 0.25 | 2 | 1.5 | 1 |
| 2009-02-04 | 0.25 | 2 | 1.5 | 1 |
| 2009-02-05 | 0.25 | 2 | 1 | 1 |
| 2009-02-06 | 0.25 | 2 | 1 | 1 |
| 2009-02-09 | 0.25 | 2 | 1 | 1 |
| 2009-02-10 | 0.25 | 2 | 1 | 1 |
| 2009-02-11 | 0.25 | 2 | 1 | 1 |
| 2009-02-12 | 0.25 | 2 | 1 | 1 |
| 2009-02-13 | 0.25 | 2 | 1 | 1 |
| 2009-02-16 | 0.25 | 2 | 1 | 1 |
| 2009-02-17 | 0.25 | 2 | 1 | 1 |
| 2009-02-18 | 0.25 | 2 | 1 | 1 |
| 2009-02-19 | 0.25 | 2 | 1 | 1 |
| 2009-02-20 | 0.25 | 2 | 1 | 1 |
| 2009-02-23 | 0.25 | 2 | 1 | 1 |
| 2009-02-24 | 0.25 | 2 | 1 | 1 |
| 2009-02-25 | 0.25 | 2 | 1 | 1 |
| 2009-02-26 | 0.25 | 2 | 1 | 1 |
| 2009-02-27 | 0.25 | 2 | 1 | 1 |
| 2009-03-02 | 0.25 | 2 | 1 | 1 |
| 2009-03-03 | 0.25 | 2 | 1 | 1 |
| 2009-03-04 | 0.25 | 2 | 1 | 1 |
| 2009-03-05 | 0.25 | 1.5 | 0.5 | 1 |
| 2009-03-06 | 0.25 | 1.5 | 0.5 | 1 |
| 2009-03-09 | 0.25 | 1.5 | 0.5 | 1 |
| 2009-03-10 | 0.25 | 1.5 | 0.5 | 1 |
| 2009-03-11 | 0.25 | 1.5 | 0.5 | 1 |
| 2009-03-12 | 0.25 | 1.5 | 0.5 | 0.75 |
| 2009-03-13 | 0.25 | 1.5 | 0.5 | 0.75 |
| 2009-03-16 | 0.25 | 1.5 | 0.5 | 0.75 |
| 2009-03-17 | 0.25 | 1.5 | 0.5 | 0.75 |
| 2009-03-18 | 0.25 | 1.5 | 0.5 | 0.75 |
| 2009-03-19 | 0.25 | 1.5 | 0.5 | 0.75 |
| 2009-03-20 | 0.25 | 1.5 | 0.5 | 0.75 |
| 2009-03-23 | 0.25 | 1.5 | 0.5 | 0.75 |
| 2009-03-24 | 0.25 | 1.5 | 0.5 | 0.75 |
| 2009-03-25 | 0.25 | 1.5 | 0.5 | 0.75 |
| 2009-03-26 | 0.25 | 1.5 | 0.5 | 0.75 |
| 2009-03-27 | 0.25 | 1.5 | 0.5 | 0.75 |
| 2009-03-30 | 0.25 | 1.5 | 0.5 | 0.75 |
| 2009-03-31 | 0.25 | 1.5 | 0.5 | 0.75 |
| 2009-04-01 | 0.25 | 1.5 | 0.5 | 0.75 |
| 2009-04-02 | 0.25 | 1.25 | 0.5 | 0.75 |
| 2009-04-03 | 0.25 | 1.25 | 0.5 | 0.75 |
| 2009-04-06 | 0.25 | 1.25 | 0.5 | 0.75 |
| 2009-04-07 | 0.25 | 1.25 | 0.5 | 0.75 |
| 2009-04-08 | 0.25 | 1.25 | 0.5 | 0.75 |
| 2009-04-09 | 0.25 | 1.25 | 0.5 | 0.75 |
| 2009-04-10 | 0.25 | 1.25 | 0.5 | 0.75 |
| 2009-04-13 | 0.25 | 1.25 | 0.5 | 0.75 |
| 2009-04-14 | 0.25 | 1.25 | 0.5 | 0.75 |
| 2009-04-15 | 0.25 | 1.25 | 0.5 | 0.75 |
| 2009-04-16 | 0.25 | 1.25 | 0.5 | 0.75 |
| 2009-04-17 | 0.25 | 1.25 | 0.5 | 0.75 |
| 2009-04-20 | 0.25 | 1.25 | 0.5 | 0.75 |
| 2009-04-21 | 0.25 | 1.25 | 0.5 | 0.75 |
| 2009-04-22 | 0.25 | 1.25 | 0.5 | 0.75 |
| 2009-04-23 | 0.25 | 1.25 | 0.5 | 0.75 |
| 2009-04-24 | 0.25 | 1.25 | 0.5 | 0.75 |
| 2009-04-27 | 0.25 | 1.25 | 0.5 | 0.75 |
| 2009-04-28 | 0.25 | 1.25 | 0.5 | 0.75 |
| 2009-04-29 | 0.25 | 1.25 | 0.5 | 0.75 |
| 2009-04-30 | 0.25 | 1.25 | 0.5 | 0.75 |
| 2009-05-01 | 0.25 | 1.25 | 0.5 | 0.75 |
| 2009-05-04 | 0.25 | 1.25 | 0.5 | 0.75 |
| 2009-05-05 | 0.25 | 1.25 | 0.5 | 0.75 |
| 2009-05-06 | 0.25 | 1.25 | 0.5 | 0.75 |
| 2009-05-07 | 0.25 | 1 | 0.5 | 0.75 |
| 2009-05-08 | 0.25 | 1 | 0.5 | 0.75 |
| 2009-05-11 | 0.25 | 1 | 0.5 | 0.75 |
| 2009-05-12 | 0.25 | 1 | 0.5 | 0.75 |
| 2009-05-13 | 0.25 | 1 | 0.5 | 0.75 |
| 2009-05-14 | 0.25 | 1 | 0.5 | 0.75 |
| 2009-05-15 | 0.25 | 1 | 0.5 | 0.75 |
| 2009-05-18 | 0.25 | 1 | 0.5 | 0.75 |
| 2009-05-19 | 0.25 | 1 | 0.5 | 0.75 |
| 2009-05-20 | 0.25 | 1 | 0.5 | 0.75 |
| 2009-05-21 | 0.25 | 1 | 0.5 | 0.75 |
| 2009-05-22 | 0.25 | 1 | 0.5 | 0.75 |
| 2009-05-25 | 0.25 | 1 | 0.5 | 0.75 |
| 2009-05-26 | 0.25 | 1 | 0.5 | 0.75 |
| 2009-05-27 | 0.25 | 1 | 0.5 | 0.75 |
| 2009-05-28 | 0.25 | 1 | 0.5 | 0.75 |
| 2009-05-29 | 0.25 | 1 | 0.5 | 0.75 |
| 2009-06-01 | 0.25 | 1 | 0.5 | 0.75 |
| 2009-06-02 | 0.25 | 1 | 0.5 | 0.75 |
| 2009-06-03 | 0.25 | 1 | 0.5 | 0.75 |
| 2009-06-04 | 0.25 | 1 | 0.5 | 0.75 |
| 2009-06-05 | 0.25 | 1 | 0.5 | 0.75 |
| 2009-06-08 | 0.25 | 1 | 0.5 | 0.75 |
| 2009-06-09 | 0.25 | 1 | 0.5 | 0.75 |
| 2009-06-10 | 0.25 | 1 | 0.5 | 0.75 |
| 2009-06-11 | 0.25 | 1 | 0.5 | 0.75 |
| 2009-06-12 | 0.25 | 1 | 0.5 | 0.75 |
| 2009-06-15 | 0.25 | 1 | 0.5 | 0.75 |
| 2009-06-16 | 0.25 | 1 | 0.5 | 0.75 |
| 2009-06-17 | 0.25 | 1 | 0.5 | 0.75 |
| 2009-06-18 | 0.25 | 1 | 0.5 | 0.75 |
| 2009-06-19 | 0.25 | 1 | 0.5 | 0.75 |
| 2009-06-22 | 0.25 | 1 | 0.5 | 0.75 |
| 2009-06-23 | 0.25 | 1 | 0.5 | 0.75 |
| 2009-06-24 | 0.25 | 1 | 0.5 | 0.75 |
| 2009-06-25 | 0.25 | 1 | 0.5 | 0.75 |
| 2009-06-26 | 0.25 | 1 | 0.5 | 0.75 |
| 2009-06-29 | 0.25 | 1 | 0.5 | 0.75 |
| 2009-06-30 | 0.25 | 1 | 0.5 | 0.75 |
| 2009-07-01 | 0.25 | 1 | 0.5 | 0.75 |
| 2009-07-02 | 0.25 | 1 | 0.5 | 0.75 |
| 2009-07-03 | 0.25 | 1 | 0.5 | 0.75 |
| 2009-07-06 | 0.25 | 1 | 0.5 | 0.75 |
| 2009-07-07 | 0.25 | 1 | 0.5 | 0.75 |
| 2009-07-08 | 0.25 | 1 | 0.5 | 0.75 |
| 2009-07-09 | 0.25 | 1 | 0.5 | 0.75 |
| 2009-07-10 | 0.25 | 1 | 0.5 | 0.75 |
| 2009-07-13 | 0.25 | 1 | 0.5 | 0.75 |
| 2009-07-14 | 0.25 | 1 | 0.5 | 0.75 |
| 2009-07-15 | 0.25 | 1 | 0.5 | 0.75 |
| 2009-07-16 | 0.25 | 1 | 0.5 | 0.75 |
| 2009-07-17 | 0.25 | 1 | 0.5 | 0.75 |
| 2009-07-20 | 0.25 | 1 | 0.5 | 0.75 |
| 2009-07-21 | 0.25 | 1 | 0.5 | 0.75 |
| 2009-07-22 | 0.25 | 1 | 0.5 | 0.75 |
| 2009-07-23 | 0.25 | 1 | 0.5 | 0.75 |
| 2009-07-24 | 0.25 | 1 | 0.5 | 0.75 |
| 2009-07-27 | 0.25 | 1 | 0.5 | 0.75 |
| 2009-07-28 | 0.25 | 1 | 0.5 | 0.75 |
| 2009-07-29 | 0.25 | 1 | 0.5 | 0.75 |
| 2009-07-30 | 0.25 | 1 | 0.5 | 0.75 |
| 2009-07-31 | 0.25 | 1 | 0.5 | 0.75 |
| 2009-08-03 | 0.25 | 1 | 0.5 | 0.75 |
| 2009-08-04 | 0.25 | 1 | 0.5 | 0.75 |
| 2009-08-05 | 0.25 | 1 | 0.5 | 0.75 |
| 2009-08-06 | 0.25 | 1 | 0.5 | 0.75 |
| 2009-08-07 | 0.25 | 1 | 0.5 | 0.75 |
| 2009-08-10 | 0.25 | 1 | 0.5 | 0.75 |
| 2009-08-11 | 0.25 | 1 | 0.5 | 0.75 |
| 2009-08-12 | 0.25 | 1 | 0.5 | 0.75 |
| 2009-08-13 | 0.25 | 1 | 0.5 | 0.75 |
| 2009-08-14 | 0.25 | 1 | 0.5 | 0.75 |
| 2009-08-17 | 0.25 | 1 | 0.5 | 0.75 |
| 2009-08-18 | 0.25 | 1 | 0.5 | 0.75 |
| 2009-08-19 | 0.25 | 1 | 0.5 | 0.75 |
| 2009-08-20 | 0.25 | 1 | 0.5 | 0.75 |
| 2009-08-21 | 0.25 | 1 | 0.5 | 0.75 |
| 2009-08-24 | 0.25 | 1 | 0.5 | 0.75 |
| 2009-08-25 | 0.25 | 1 | 0.5 | 0.75 |
| 2009-08-26 | 0.25 | 1 | 0.5 | 0.75 |
| 2009-08-27 | 0.25 | 1 | 0.5 | 0.75 |
| 2009-08-28 | 0.25 | 1 | 0.5 | 0.75 |
| 2009-08-31 | 0.25 | 1 | 0.5 | 0.75 |
| 2009-09-01 | 0.25 | 1 | 0.5 | 0.75 |
| 2009-09-02 | 0.25 | 1 | 0.5 | 0.75 |
| 2009-09-03 | 0.25 | 1 | 0.5 | 0.75 |
| 2009-09-04 | 0.25 | 1 | 0.5 | 0.75 |
| 2009-09-07 | 0.25 | 1 | 0.5 | 0.75 |
| 2009-09-08 | 0.25 | 1 | 0.5 | 0.75 |
| 2009-09-09 | 0.25 | 1 | 0.5 | 0.75 |
| 2009-09-10 | 0.25 | 1 | 0.5 | 0.75 |
| 2009-09-11 | 0.25 | 1 | 0.5 | 0.75 |
| 2009-09-14 | 0.25 | 1 | 0.5 | 0.75 |
| 2009-09-15 | 0.25 | 1 | 0.5 | 0.75 |
| 2009-09-16 | 0.25 | 1 | 0.5 | 0.75 |
| 2009-09-17 | 0.25 | 1 | 0.5 | 0.75 |
| 2009-09-18 | 0.25 | 1 | 0.5 | 0.75 |
| 2009-09-21 | 0.25 | 1 | 0.5 | 0.75 |
| 2009-09-22 | 0.25 | 1 | 0.5 | 0.75 |
| 2009-09-23 | 0.25 | 1 | 0.5 | 0.75 |
| 2009-09-24 | 0.25 | 1 | 0.5 | 0.75 |
| 2009-09-25 | 0.25 | 1 | 0.5 | 0.75 |
| 2009-09-28 | 0.25 | 1 | 0.5 | 0.75 |
| 2009-09-29 | 0.25 | 1 | 0.5 | 0.75 |
| 2009-09-30 | 0.25 | 1 | 0.5 | 0.75 |
| 2009-10-01 | 0.25 | 1 | 0.5 | 0.75 |
| 2009-10-02 | 0.25 | 1 | 0.5 | 0.75 |
| 2009-10-05 | 0.25 | 1 | 0.5 | 0.75 |
| 2009-10-06 | 0.25 | 1 | 0.5 | 0.75 |
| 2009-10-07 | 0.25 | 1 | 0.5 | 0.75 |
| 2009-10-08 | 0.25 | 1 | 0.5 | 0.75 |
| 2009-10-09 | 0.25 | 1 | 0.5 | 0.75 |
| 2009-10-12 | 0.25 | 1 | 0.5 | 0.75 |
| 2009-10-13 | 0.25 | 1 | 0.5 | 0.75 |
| 2009-10-14 | 0.25 | 1 | 0.5 | 0.75 |
| 2009-10-15 | 0.25 | 1 | 0.5 | 0.75 |
| 2009-10-16 | 0.25 | 1 | 0.5 | 0.75 |
| 2009-10-19 | 0.25 | 1 | 0.5 | 0.75 |
| 2009-10-20 | 0.25 | 1 | 0.5 | 0.75 |
| 2009-10-21 | 0.25 | 1 | 0.5 | 0.75 |
| 2009-10-22 | 0.25 | 1 | 0.5 | 0.75 |
| 2009-10-23 | 0.25 | 1 | 0.5 | 0.75 |
| 2009-10-26 | 0.25 | 1 | 0.5 | 0.75 |
| 2009-10-27 | 0.25 | 1 | 0.5 | 0.75 |
| 2009-10-28 | 0.25 | 1 | 0.5 | 0.75 |
| 2009-10-29 | 0.25 | 1 | 0.5 | 0.75 |
| 2009-10-30 | 0.25 | 1 | 0.5 | 0.75 |
| 2009-11-02 | 0.25 | 1 | 0.5 | 0.75 |
| 2009-11-03 | 0.25 | 1 | 0.5 | 0.75 |
| 2009-11-04 | 0.25 | 1 | 0.5 | 0.75 |
| 2009-11-05 | 0.25 | 1 | 0.5 | 0.75 |
| 2009-11-06 | 0.25 | 1 | 0.5 | 0.75 |
| 2009-11-09 | 0.25 | 1 | 0.5 | 0.75 |
| 2009-11-10 | 0.25 | 1 | 0.5 | 0.75 |
| 2009-11-11 | 0.25 | 1 | 0.5 | 0.75 |
| 2009-11-12 | 0.25 | 1 | 0.5 | 0.75 |
| 2009-11-13 | 0.25 | 1 | 0.5 | 0.75 |
| 2009-11-16 | 0.25 | 1 | 0.5 | 0.75 |
| 2009-11-17 | 0.25 | 1 | 0.5 | 0.75 |
| 2009-11-18 | 0.25 | 1 | 0.5 | 0.75 |
| 2009-11-19 | 0.25 | 1 | 0.5 | 0.75 |
| 2009-11-20 | 0.25 | 1 | 0.5 | 0.75 |
| 2009-11-23 | 0.25 | 1 | 0.5 | 0.75 |
| 2009-11-24 | 0.25 | 1 | 0.5 | 0.75 |
| 2009-11-25 | 0.25 | 1 | 0.5 | 0.75 |
| 2009-11-26 | 0.25 | 1 | 0.5 | 0.75 |
| 2009-11-27 | 0.25 | 1 | 0.5 | 0.75 |
| 2009-11-30 | 0.25 | 1 | 0.5 | 0.75 |
| 2009-12-01 | 0.25 | 1 | 0.5 | 0.75 |
| 2009-12-02 | 0.25 | 1 | 0.5 | 0.75 |
| 2009-12-03 | 0.25 | 1 | 0.5 | 0.75 |
| 2009-12-04 | 0.25 | 1 | 0.5 | 0.75 |
| 2009-12-07 | 0.25 | 1 | 0.5 | 0.75 |
| 2009-12-08 | 0.25 | 1 | 0.5 | 0.75 |
| 2009-12-09 | 0.25 | 1 | 0.5 | 0.75 |
| 2009-12-10 | 0.25 | 1 | 0.5 | 0.75 |
| 2009-12-11 | 0.25 | 1 | 0.5 | 0.75 |
| 2009-12-14 | 0.25 | 1 | 0.5 | 0.75 |
| 2009-12-15 | 0.25 | 1 | 0.5 | 0.75 |
| 2009-12-16 | 0.25 | 1 | 0.5 | 0.75 |
| 2009-12-17 | 0.25 | 1 | 0.5 | 0.75 |
| 2009-12-18 | 0.25 | 1 | 0.5 | 0.75 |
| 2009-12-21 | 0.25 | 1 | 0.5 | 0.75 |
| 2009-12-22 | 0.25 | 1 | 0.5 | 0.75 |
| 2009-12-23 | 0.25 | 1 | 0.5 | 0.75 |
| 2009-12-24 | 0.25 | 1 | 0.5 | 0.75 |
| 2009-12-25 | 0.25 | 1 | 0.5 | 0.75 |
| 2009-12-28 | 0.25 | 1 | 0.5 | 0.75 |
| 2009-12-29 | 0.25 | 1 | 0.5 | 0.75 |
| 2009-12-30 | 0.25 | 1 | 0.5 | 0.75 |
| 2009-12-31 | 0.25 | 1 | 0.5 | 0.75 |